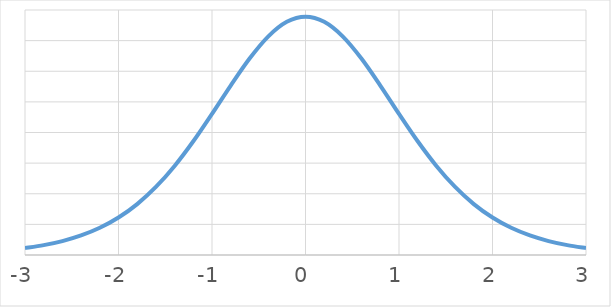
| Category | height |
|---|---|
| -3.0 | 0.011 |
| -2.8 | 0.016 |
| -2.6 | 0.023 |
| -2.4 | 0.032 |
| -2.2 | 0.044 |
| -2.0 | 0.061 |
| -1.8 | 0.083 |
| -1.6 | 0.111 |
| -1.4 | 0.145 |
| -1.2 | 0.186 |
| -1.0 | 0.23 |
| -0.8 | 0.277 |
| -0.6 | 0.32 |
| -0.4 | 0.357 |
| -0.2 | 0.381 |
| 0.0 | 0.389 |
| 0.2 | 0.381 |
| 0.4 | 0.357 |
| 0.6 | 0.32 |
| 0.8 | 0.277 |
| 1.0 | 0.23 |
| 1.2 | 0.186 |
| 1.4 | 0.145 |
| 1.6 | 0.111 |
| 1.8 | 0.083 |
| 2.0 | 0.061 |
| 2.2 | 0.044 |
| 2.4 | 0.032 |
| 2.6 | 0.023 |
| 2.80000000000001 | 0.016 |
| 3.00000000000001 | 0.011 |